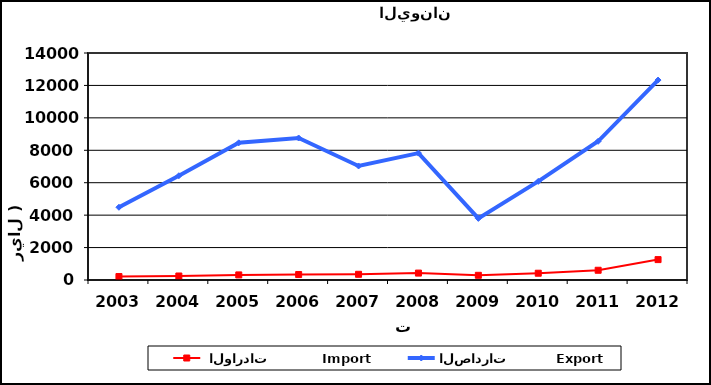
| Category |  الواردات           Import | الصادرات          Export |
|---|---|---|
| 2003.0 | 213 | 4485 |
| 2004.0 | 247 | 6430 |
| 2005.0 | 314 | 8461 |
| 2006.0 | 337 | 8758 |
| 2007.0 | 351 | 7032 |
| 2008.0 | 426 | 7827 |
| 2009.0 | 290 | 3799 |
| 2010.0 | 418 | 6082 |
| 2011.0 | 601 | 8555 |
| 2012.0 | 1258 | 12331 |